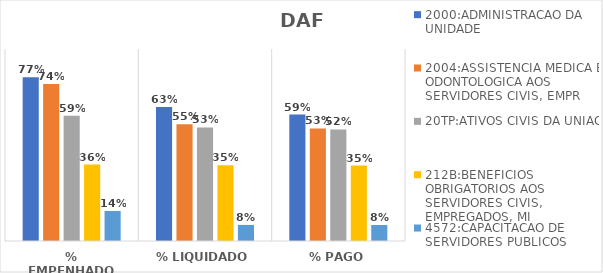
| Category | 2000:ADMINISTRACAO DA UNIDADE | 2004:ASSISTENCIA MEDICA E ODONTOLOGICA AOS SERVIDORES CIVIS, EMPR | 20TP:ATIVOS CIVIS DA UNIAO | 212B:BENEFICIOS OBRIGATORIOS AOS SERVIDORES CIVIS, EMPREGADOS, MI | 4572:CAPACITACAO DE SERVIDORES PUBLICOS FEDERAIS EM PROCESSO DE Q |
|---|---|---|---|---|---|
| % EMPENHADO | 0.768 | 0.736 | 0.587 | 0.358 | 0.141 |
| % LIQUIDADO | 0.628 | 0.547 | 0.532 | 0.355 | 0.075 |
| % PAGO | 0.593 | 0.528 | 0.523 | 0.354 | 0.075 |